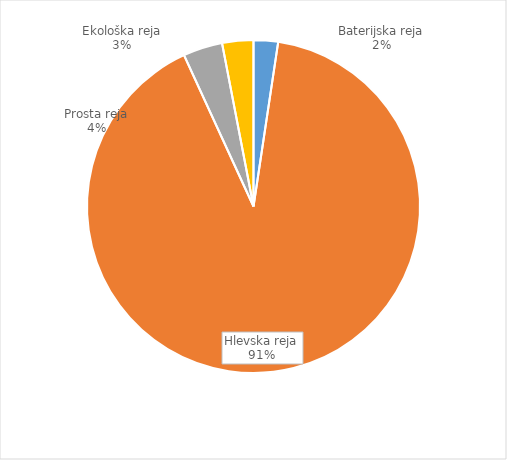
| Category | Količina kosov jajc |
|---|---|
| Baterijska reja | 79100 |
| Hlevska reja | 3026206 |
| Prosta reja | 127448 |
| Ekološka reja | 101020 |